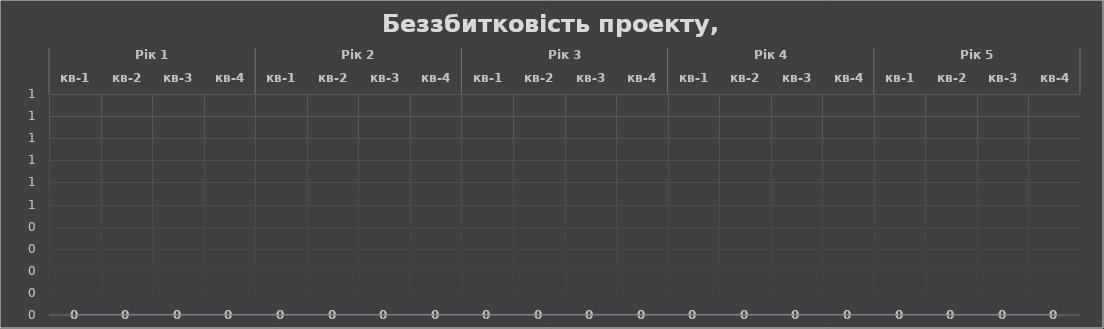
| Category | Беззбитковість проекту, грн |
|---|---|
| 0 | 0 |
| 1 | 0 |
| 2 | 0 |
| 3 | 0 |
| 4 | 0 |
| 5 | 0 |
| 6 | 0 |
| 7 | 0 |
| 8 | 0 |
| 9 | 0 |
| 10 | 0 |
| 11 | 0 |
| 12 | 0 |
| 13 | 0 |
| 14 | 0 |
| 15 | 0 |
| 16 | 0 |
| 17 | 0 |
| 18 | 0 |
| 19 | 0 |